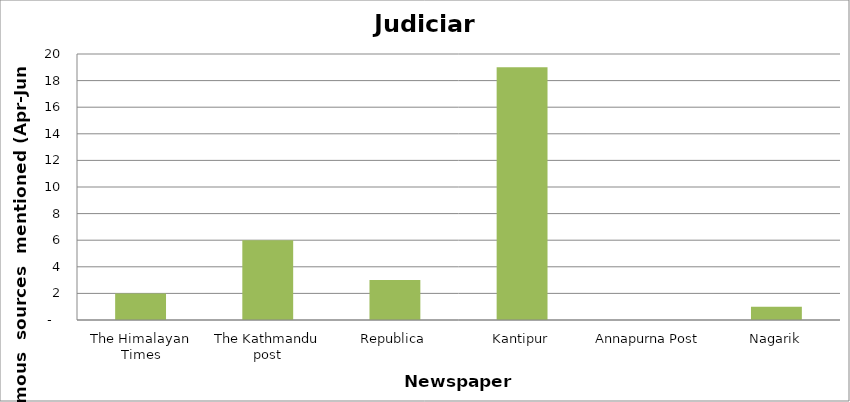
| Category | Judiciary |
|---|---|
| The Himalayan Times | 2 |
| The Kathmandu post | 6 |
| Republica | 3 |
| Kantipur | 19 |
| Annapurna Post | 0 |
| Nagarik | 1 |